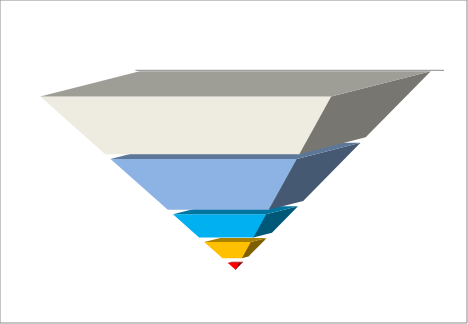
| Category | customer contacts | Series 1 | interest | Series 3 | detailed offer | Series 5 | negotiations | Series 7 | contracts |
|---|---|---|---|---|---|---|---|---|---|
| Numbers | 25000 | 2000 | 22000 | 2000 | 10000 | 2000 | 7000 | 2000 | 3000 |